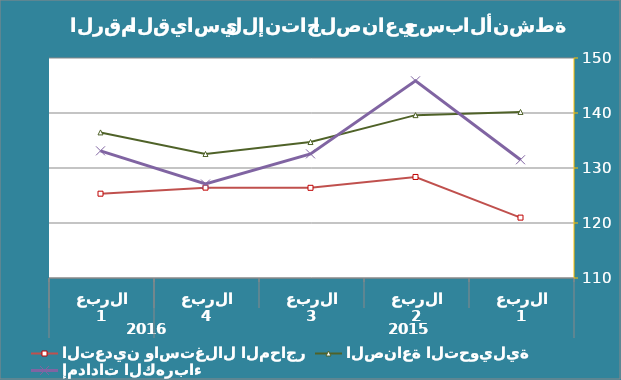
| Category | التعدين واستغلال المحاجر | الصناعة التحويلية | إمدادات الكهرباء |
|---|---|---|---|
| 0 | 120.98 | 140.19 | 131.5 |
| 1 | 128.37 | 139.61 | 145.85 |
| 2 | 126.4 | 134.72 | 132.57 |
| 3 | 126.43 | 132.55 | 127.09 |
| 4 | 125.33 | 136.47 | 133.12 |